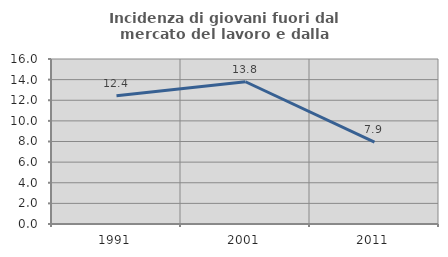
| Category | Incidenza di giovani fuori dal mercato del lavoro e dalla formazione  |
|---|---|
| 1991.0 | 12.44 |
| 2001.0 | 13.793 |
| 2011.0 | 7.937 |